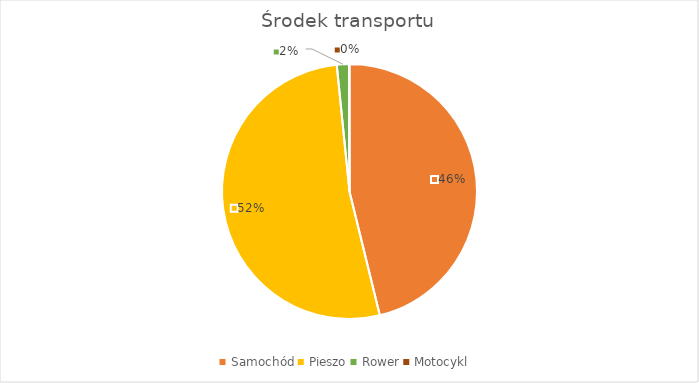
| Category | Series 0 |
|---|---|
| Samochód | 779 |
| Pieszo | 881 |
| Rower | 26 |
| Motocykl | 1 |